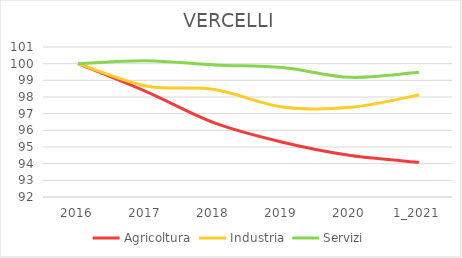
| Category | Agricoltura | Industria | Servizi |
|---|---|---|---|
| 2016 | 100 | 100 | 100 |
| 2017 | 98.321 | 98.659 | 100.179 |
| 2018 | 96.443 | 98.453 | 99.925 |
| 2019 | 95.284 | 97.401 | 99.764 |
| 2020 | 94.484 | 97.38 | 99.179 |
| 1_2021 | 94.085 | 98.123 | 99.49 |